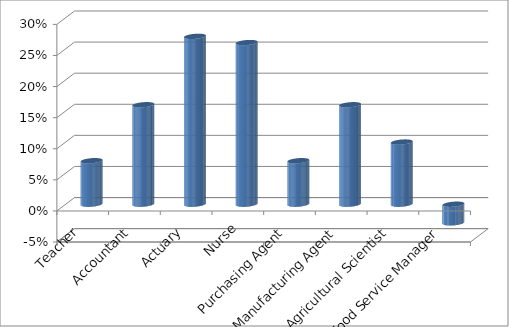
| Category | Series 0 |
|---|---|
| Teacher | 0.07 |
| Accountant | 0.16 |
| Actuary | 0.27 |
| Nurse | 0.26 |
| Purchasing Agent | 0.07 |
| Manufacturing Agent | 0.16 |
| Agricultural Scientist | 0.1 |
| Food Service Manager | -0.03 |